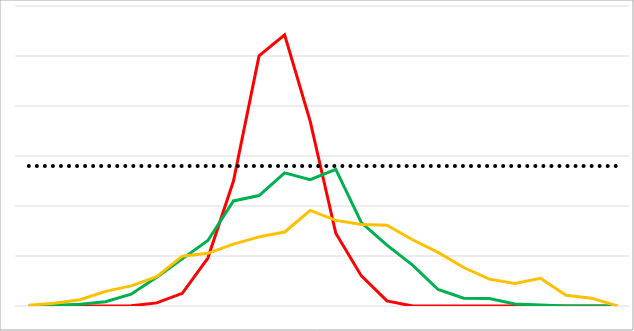
| Category | Count 1 | Count 2 | Constant | Series 3 |
|---|---|---|---|---|
| 0 | 0 | 94.415 | 140000 | 797.318 |
| 1 | 0 | 690.643 | 140000 | 2712.203 |
| 2 | 0 | 1828.324 | 140000 | 6214.575 |
| 3 | 0 | 4298.222 | 140000 | 14614.959 |
| 4 | 239.593 | 11834.169 | 140000 | 20118.518 |
| 5 | 3116.762 | 28644.988 | 140000 | 29366.361 |
| 6 | 12677.161 | 47154.491 | 140000 | 49858.437 |
| 7 | 47976.868 | 65532.118 | 140000 | 52676.749 |
| 8 | 124944.973 | 105070.688 | 140000 | 61915.28 |
| 9 | 250150.956 | 110439.802 | 140000 | 69118.482 |
| 10 | 271169.706 | 133128.343 | 140000 | 74006.757 |
| 11 | 184583.273 | 126304.492 | 140000 | 95550.492 |
| 12 | 72729.674 | 136619.945 | 140000 | 85599.458 |
| 13 | 30076.623 | 83322.493 | 140000 | 81482.471 |
| 14 | 5058.144 | 60894.646 | 140000 | 80818.949 |
| 15 | 0 | 40923.989 | 140000 | 66240.679 |
| 16 | 0 | 16497.155 | 140000 | 53570.662 |
| 17 | 0 | 7849.967 | 140000 | 38486.696 |
| 18 | 0 | 7398.663 | 140000 | 26856.274 |
| 19 | 0 | 1925.395 | 140000 | 22438.391 |
| 20 | 0 | 1012.293 | 140000 | 27655.918 |
| 21 | 0 | 0 | 140000 | 10715.902 |
| 22 | 0 | 0 | 140000 | 7822.913 |
| 23 | 0 | 0 | 140000 | 0 |